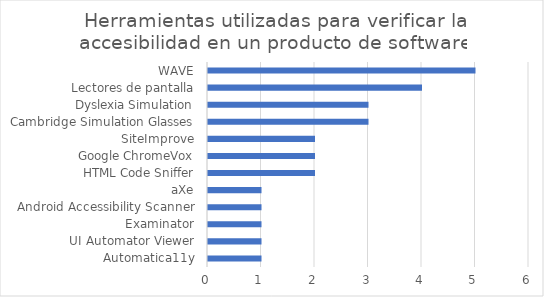
| Category | Frecuencia |
|---|---|
| Automatica11y | 1 |
| UI Automator Viewer | 1 |
| Examinator | 1 |
| Android Accessibility Scanner | 1 |
| aXe | 1 |
| HTML Code Sniffer | 2 |
| Google ChromeVox | 2 |
| SiteImprove | 2 |
| Cambridge Simulation Glasses | 3 |
| Dyslexia Simulation | 3 |
| Lectores de pantalla | 4 |
| WAVE | 5 |